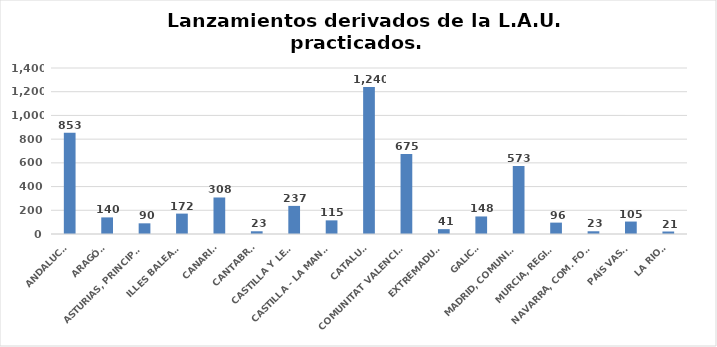
| Category | Series 0 |
|---|---|
| ANDALUCÍA | 853 |
| ARAGÓN | 140 |
| ASTURIAS, PRINCIPADO | 90 |
| ILLES BALEARS | 172 |
| CANARIAS | 308 |
| CANTABRIA | 23 |
| CASTILLA Y LEÓN | 237 |
| CASTILLA - LA MANCHA | 115 |
| CATALUÑA | 1240 |
| COMUNITAT VALENCIANA | 675 |
| EXTREMADURA | 41 |
| GALICIA | 148 |
| MADRID, COMUNIDAD | 573 |
| MURCIA, REGIÓN | 96 |
| NAVARRA, COM. FORAL | 23 |
| PAÍS VASCO | 105 |
| LA RIOJA | 21 |